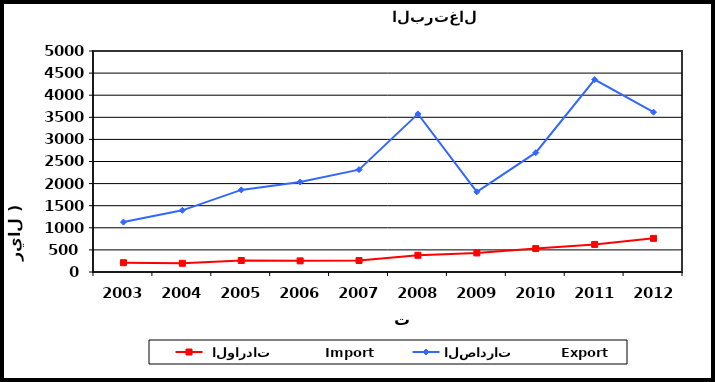
| Category |  الواردات           Import | الصادرات          Export |
|---|---|---|
| 2003.0 | 210 | 1129 |
| 2004.0 | 197 | 1395 |
| 2005.0 | 260 | 1857 |
| 2006.0 | 252 | 2035 |
| 2007.0 | 259 | 2316 |
| 2008.0 | 378 | 3577 |
| 2009.0 | 431 | 1814 |
| 2010.0 | 530 | 2699 |
| 2011.0 | 624 | 4353 |
| 2012.0 | 761 | 3616 |